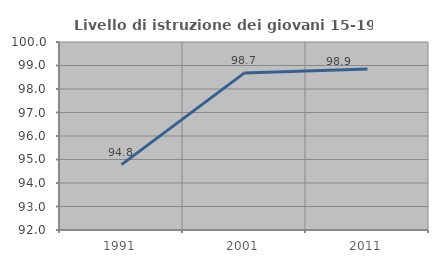
| Category | Livello di istruzione dei giovani 15-19 anni |
|---|---|
| 1991.0 | 94.782 |
| 2001.0 | 98.686 |
| 2011.0 | 98.853 |